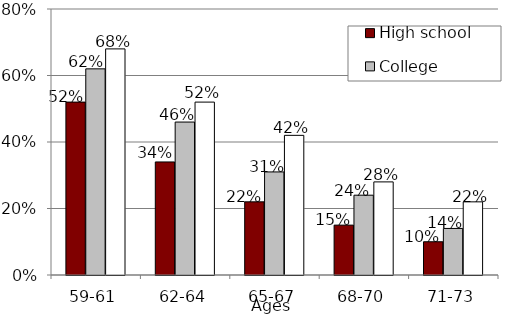
| Category | High school  | College | Advanced degree |
|---|---|---|---|
| 59-61 | 0.52 | 0.62 | 0.68 |
| 62-64 | 0.34 | 0.46 | 0.52 |
| 65-67 | 0.22 | 0.31 | 0.42 |
| 68-70 | 0.15 | 0.24 | 0.28 |
| 71-73 | 0.1 | 0.14 | 0.22 |